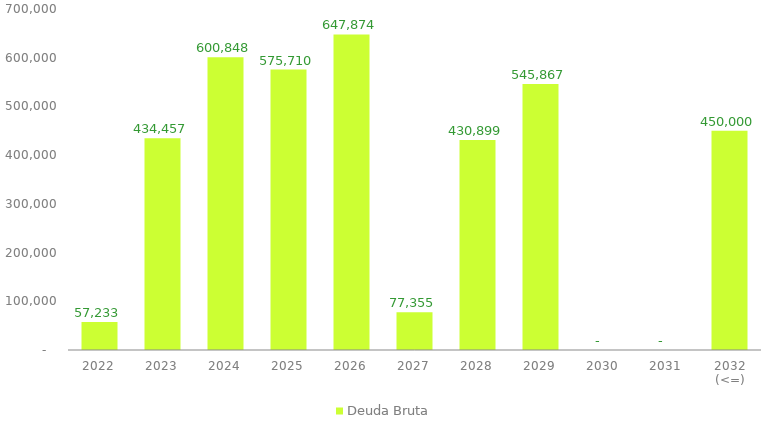
| Category | Deuda Bruta |
|---|---|
| 2022 | 57232.948 |
| 2023 | 434456.951 |
| 2024 | 600847.985 |
| 2025 | 575709.854 |
| 2026 | 647873.721 |
| 2027 | 77354.957 |
| 2028 | 430899.316 |
| 2029 | 545867.35 |
| 2030 | 0 |
| 2031 | 0 |
| 2032 (<=) | 450000 |